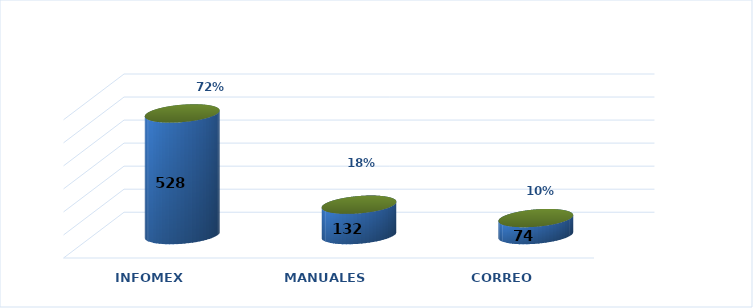
| Category | Series 0 | Series 1 |
|---|---|---|
| INFOMEX | 528 | 0.719 |
| MANUALES | 132 | 0.18 |
| CORREO | 74 | 0.101 |